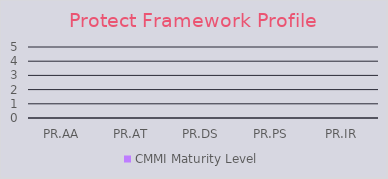
| Category | CMMI Maturity Level |
|---|---|
| PR.AA | 0 |
| PR.AT | 0 |
| PR.DS | 0 |
| PR.PS | 0 |
| PR.IR | 0 |